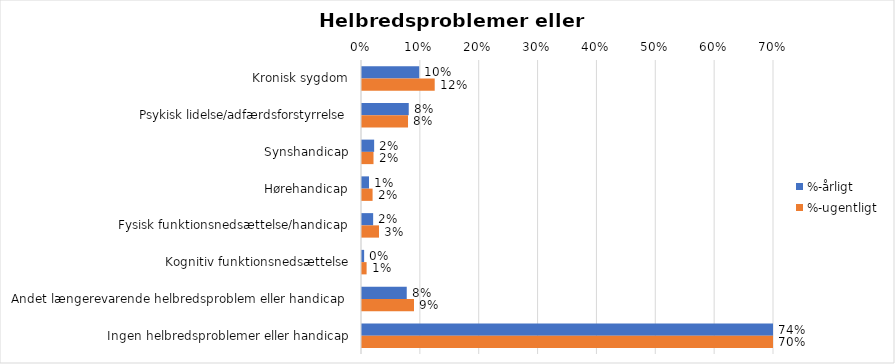
| Category | %-årligt | %-ugentligt |
|---|---|---|
| Kronisk sygdom | 0.097 | 0.124 |
| Psykisk lidelse/adfærdsforstyrrelse | 0.079 | 0.078 |
| Synshandicap | 0.021 | 0.02 |
| Hørehandicap | 0.012 | 0.018 |
| Fysisk funktionsnedsættelse/handicap | 0.019 | 0.029 |
| Kognitiv funktionsnedsættelse | 0.004 | 0.008 |
| Andet længerevarende helbredsproblem eller handicap  | 0.076 | 0.088 |
| Ingen helbredsproblemer eller handicap | 0.742 | 0.704 |